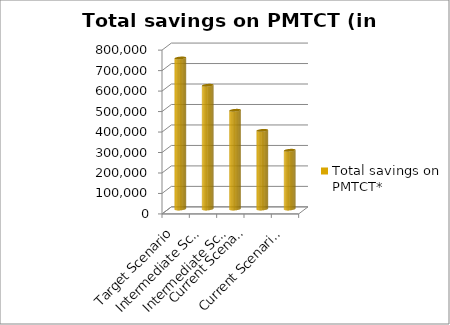
| Category | Total savings on PMTCT* |
|---|---|
| Target Scenario | 737633.019 |
| Intermediate Scenario 2 | 604399.277 |
| Intermediate Scenario 1 | 482203.636 |
| Current Scenario 
with ANC data | 384055.341 |
| Current Scenario without ANC data | 286937.018 |